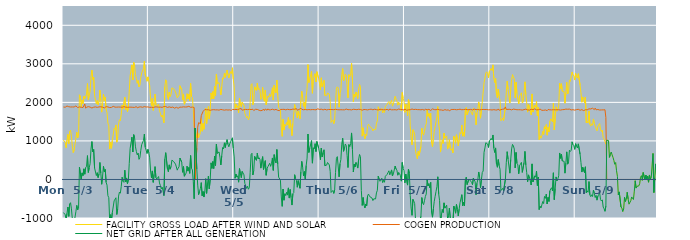
| Category | FACILITY GROSS LOAD AFTER WIND AND SOLAR | COGEN PRODUCTION | NET GRID AFTER ALL GENERATION |
|---|---|---|---|
|  Mon  5/3 | 1020 | 1879 | -859 |
|  Mon  5/3 | 1006 | 1865 | -859 |
|  Mon  5/3 | 959 | 1874 | -915 |
|  Mon  5/3 | 821 | 1864 | -1043 |
|  Mon  5/3 | 1027 | 1906 | -879 |
|  Mon  5/3 | 1168 | 1883 | -715 |
|  Mon  5/3 | 931 | 1887 | -956 |
|  Mon  5/3 | 1247 | 1882 | -635 |
|  Mon  5/3 | 1277 | 1880 | -603 |
|  Mon  5/3 | 1108 | 1871 | -763 |
|  Mon  5/3 | 859 | 1881 | -1022 |
|  Mon  5/3 | 697 | 1879 | -1182 |
|  Mon  5/3 | 758 | 1880 | -1122 |
|  Mon  5/3 | 781 | 1889 | -1108 |
|  Mon  5/3 | 1074 | 1907 | -833 |
|  Mon  5/3 | 1224 | 1897 | -673 |
|  Mon  5/3 | 1075 | 1865 | -790 |
|  Mon  5/3 | 1133 | 1890 | -757 |
|  Mon  5/3 | 2198 | 1882 | 316 |
|  Mon  5/3 | 2166 | 1873 | 293 |
|  Mon  5/3 | 1882 | 1872 | 10 |
|  Mon  5/3 | 2064 | 1894 | 170 |
|  Mon  5/3 | 1967 | 1866 | 101 |
|  Mon  5/3 | 2160 | 1884 | 276 |
|  Mon  5/3 | 2093 | 1957 | 136 |
|  Mon  5/3 | 2156 | 1848 | 308 |
|  Mon  5/3 | 2215 | 1874 | 341 |
|  Mon  5/3 | 2488 | 1870 | 618 |
|  Mon  5/3 | 2070 | 1889 | 181 |
|  Mon  5/3 | 2180 | 1874 | 306 |
|  Mon  5/3 | 2287 | 1877 | 410 |
|  Mon  5/3 | 2663 | 1876 | 787 |
|  Mon  5/3 | 2836 | 1853 | 983 |
|  Mon  5/3 | 2590 | 1875 | 715 |
|  Mon  5/3 | 2651 | 1875 | 776 |
|  Mon  5/3 | 2177 | 1880 | 297 |
|  Mon  5/3 | 2174 | 1882 | 292 |
|  Mon  5/3 | 1959 | 1859 | 100 |
|  Mon  5/3 | 2046 | 1870 | 176 |
|  Mon  5/3 | 1936 | 1887 | 49 |
|  Mon  5/3 | 2024 | 1882 | 142 |
|  Mon  5/3 | 2317 | 1876 | 441 |
|  Mon  5/3 | 2052 | 1885 | 167 |
|  Mon  5/3 | 1746 | 1871 | -125 |
|  Mon  5/3 | 1957 | 1876 | 81 |
|  Mon  5/3 | 2214 | 1874 | 340 |
|  Mon  5/3 | 2050 | 1855 | 195 |
|  Mon  5/3 | 2137 | 1878 | 259 |
|  Mon  5/3 | 1814 | 1890 | -76 |
|  Mon  5/3 | 1733 | 1881 | -148 |
|  Mon  5/3 | 1461 | 1882 | -421 |
|  Mon  5/3 | 1394 | 1867 | -473 |
|  Mon  5/3 | 789 | 1864 | -1075 |
|  Mon  5/3 | 965 | 1880 | -915 |
|  Mon  5/3 | 808 | 1869 | -1061 |
|  Mon  5/3 | 1012 | 1869 | -857 |
|  Mon  5/3 | 1035 | 1897 | -862 |
|  Mon  5/3 | 1329 | 1884 | -555 |
|  Mon  5/3 | 1302 | 1876 | -574 |
|  Mon  5/3 | 1414 | 1889 | -475 |
|  Mon  5/3 | 967 | 1876 | -909 |
|  Mon  5/3 | 1098 | 1864 | -766 |
|  Mon  5/3 | 1448 | 1879 | -431 |
|  Mon  5/3 | 1552 | 1879 | -327 |
|  Mon  5/3 | 1520 | 1877 | -357 |
|  Mon  5/3 | 1688 | 1871 | -183 |
|  Mon  5/3 | 1930 | 1873 | 57 |
|  Mon  5/3 | 1829 | 1876 | -47 |
|  Mon  5/3 | 1813 | 1888 | -75 |
|  Mon  5/3 | 2133 | 1892 | 241 |
|  Mon  5/3 | 1811 | 1876 | -65 |
|  Mon  5/3 | 1918 | 1879 | 39 |
|  Mon  5/3 | 1761 | 1871 | -110 |
|  Mon  5/3 | 1856 | 1865 | -9 |
|  Mon  5/3 | 2288 | 1875 | 413 |
|  Mon  5/3 | 2692 | 1887 | 805 |
|  Mon  5/3 | 2696 | 1876 | 820 |
|  Mon  5/3 | 2972 | 1875 | 1097 |
|  Mon  5/3 | 2584 | 1872 | 712 |
|  Mon  5/3 | 3037 | 1874 | 1163 |
|  Mon  5/3 | 2951 | 1869 | 1082 |
|  Mon  5/3 | 2718 | 1872 | 846 |
|  Mon  5/3 | 2616 | 1891 | 725 |
|  Mon  5/3 | 2495 | 1857 | 638 |
|  Mon  5/3 | 2566 | 1881 | 685 |
|  Mon  5/3 | 2401 | 1879 | 522 |
|  Mon  5/3 | 2448 | 1875 | 573 |
|  Mon  5/3 | 2641 | 1883 | 758 |
|  Mon  5/3 | 2765 | 1863 | 902 |
|  Mon  5/3 | 2765 | 1872 | 893 |
|  Mon  5/3 | 2880 | 1867 | 1013 |
|  Mon  5/3 | 3066 | 1890 | 1176 |
|  Mon  5/3 | 2710 | 1876 | 834 |
|  Mon  5/3 | 2641 | 1879 | 762 |
|  Mon  5/3 | 2547 | 1873 | 674 |
|  Mon  5/3 | 2661 | 1882 | 779 |
|  Tue  5/4 | 2564 | 1869 | 695 |
|  Tue  5/4 | 2431 | 1871 | 560 |
|  Tue  5/4 | 2094 | 1875 | 219 |
|  Tue  5/4 | 1917 | 1873 | 44 |
|  Tue  5/4 | 2102 | 1881 | 221 |
|  Tue  5/4 | 1792 | 1867 | -75 |
|  Tue  5/4 | 2001 | 1867 | 134 |
|  Tue  5/4 | 2215 | 1882 | 333 |
|  Tue  5/4 | 1931 | 1887 | 44 |
|  Tue  5/4 | 1895 | 1882 | 13 |
|  Tue  5/4 | 1900 | 1890 | 10 |
|  Tue  5/4 | 1951 | 1875 | 76 |
|  Tue  5/4 | 1783 | 1874 | -91 |
|  Tue  5/4 | 1721 | 1877 | -156 |
|  Tue  5/4 | 1626 | 1871 | -245 |
|  Tue  5/4 | 1672 | 1871 | -199 |
|  Tue  5/4 | 1575 | 1869 | -294 |
|  Tue  5/4 | 1469 | 1890 | -421 |
|  Tue  5/4 | 2404 | 1876 | 528 |
|  Tue  5/4 | 2587 | 1892 | 695 |
|  Tue  5/4 | 2555 | 1872 | 683 |
|  Tue  5/4 | 2136 | 1868 | 268 |
|  Tue  5/4 | 2077 | 1879 | 198 |
|  Tue  5/4 | 2263 | 1884 | 379 |
|  Tue  5/4 | 2150 | 1883 | 267 |
|  Tue  5/4 | 2204 | 1867 | 337 |
|  Tue  5/4 | 2377 | 1875 | 502 |
|  Tue  5/4 | 2375 | 1879 | 496 |
|  Tue  5/4 | 2350 | 1887 | 463 |
|  Tue  5/4 | 2308 | 1849 | 459 |
|  Tue  5/4 | 2270 | 1872 | 398 |
|  Tue  5/4 | 2196 | 1872 | 324 |
|  Tue  5/4 | 2120 | 1879 | 241 |
|  Tue  5/4 | 2139 | 1847 | 292 |
|  Tue  5/4 | 2188 | 1860 | 328 |
|  Tue  5/4 | 2433 | 1877 | 556 |
|  Tue  5/4 | 2427 | 1876 | 551 |
|  Tue  5/4 | 2322 | 1875 | 447 |
|  Tue  5/4 | 2069 | 1883 | 186 |
|  Tue  5/4 | 2219 | 1884 | 335 |
|  Tue  5/4 | 1950 | 1868 | 82 |
|  Tue  5/4 | 1957 | 1879 | 78 |
|  Tue  5/4 | 2042 | 1875 | 167 |
|  Tue  5/4 | 2225 | 1881 | 344 |
|  Tue  5/4 | 2088 | 1871 | 217 |
|  Tue  5/4 | 2208 | 1898 | 310 |
|  Tue  5/4 | 2040 | 1881 | 159 |
|  Tue  5/4 | 2491 | 1871 | 620 |
|  Tue  5/4 | 2153 | 1862 | 291 |
|  Tue  5/4 | 2125 | 1878 | 247 |
|  Tue  5/4 | 1823 | 1870 | -47 |
|  Tue  5/4 | 1366 | 1866 | -500 |
|  Tue  5/4 | 1334 | 0 | 1334 |
|  Tue  5/4 | 1318 | 0 | 1318 |
|  Tue  5/4 | 1082 | 813 | 269 |
|  Tue  5/4 | 1209 | 1356 | -147 |
|  Tue  5/4 | 1079 | 1473 | -394 |
|  Tue  5/4 | 1141 | 1451 | -310 |
|  Tue  5/4 | 1215 | 1449 | -234 |
|  Tue  5/4 | 1574 | 1657 | -83 |
|  Tue  5/4 | 1251 | 1673 | -422 |
|  Tue  5/4 | 1451 | 1763 | -312 |
|  Tue  5/4 | 1301 | 1757 | -456 |
|  Tue  5/4 | 1507 | 1815 | -308 |
|  Tue  5/4 | 1851 | 1830 | 21 |
|  Tue  5/4 | 1448 | 1809 | -361 |
|  Tue  5/4 | 1683 | 1803 | -120 |
|  Tue  5/4 | 1893 | 1808 | 85 |
|  Tue  5/4 | 1568 | 1812 | -244 |
|  Tue  5/4 | 1780 | 1793 | -13 |
|  Tue  5/4 | 2245 | 1814 | 431 |
|  Tue  5/4 | 2092 | 1806 | 286 |
|  Tue  5/4 | 2278 | 1813 | 465 |
|  Tue  5/4 | 2093 | 1810 | 283 |
|  Tue  5/4 | 2415 | 1809 | 606 |
|  Tue  5/4 | 2164 | 1805 | 359 |
|  Tue  5/4 | 2732 | 1818 | 914 |
|  Tue  5/4 | 2481 | 1806 | 675 |
|  Tue  5/4 | 2497 | 1805 | 692 |
|  Tue  5/4 | 2513 | 1798 | 715 |
|  Tue  5/4 | 2373 | 1794 | 579 |
|  Tue  5/4 | 2193 | 1817 | 376 |
|  Tue  5/4 | 2402 | 1794 | 608 |
|  Tue  5/4 | 2636 | 1807 | 829 |
|  Tue  5/4 | 2609 | 1818 | 791 |
|  Tue  5/4 | 2749 | 1798 | 951 |
|  Tue  5/4 | 2650 | 1822 | 828 |
|  Tue  5/4 | 2759 | 1807 | 952 |
|  Tue  5/4 | 2840 | 1806 | 1034 |
|  Tue  5/4 | 2712 | 1801 | 911 |
|  Tue  5/4 | 2632 | 1785 | 847 |
|  Tue  5/4 | 2728 | 1805 | 923 |
|  Tue  5/4 | 2799 | 1819 | 980 |
|  Tue  5/4 | 2749 | 1790 | 959 |
|  Tue  5/4 | 2898 | 1818 | 1080 |
|  Tue  5/4 | 2604 | 1799 | 805 |
|  Wed  5/5 | 2396 | 1812 | 584 |
|  Wed  5/5 | 1841 | 1811 | 30 |
|  Wed  5/5 | 1956 | 1816 | 140 |
|  Wed  5/5 | 1871 | 1809 | 62 |
|  Wed  5/5 | 1905 | 1810 | 95 |
|  Wed  5/5 | 1730 | 1801 | -71 |
|  Wed  5/5 | 2114 | 1833 | 281 |
|  Wed  5/5 | 1958 | 1809 | 149 |
|  Wed  5/5 | 1883 | 1837 | 46 |
|  Wed  5/5 | 2007 | 1797 | 210 |
|  Wed  5/5 | 2001 | 1815 | 186 |
|  Wed  5/5 | 1929 | 1809 | 120 |
|  Wed  5/5 | 1710 | 1815 | -105 |
|  Wed  5/5 | 1650 | 1818 | -168 |
|  Wed  5/5 | 1602 | 1834 | -232 |
|  Wed  5/5 | 1636 | 1812 | -176 |
|  Wed  5/5 | 1546 | 1800 | -254 |
|  Wed  5/5 | 1607 | 1819 | -212 |
|  Wed  5/5 | 1992 | 1807 | 185 |
|  Wed  5/5 | 2458 | 1813 | 645 |
|  Wed  5/5 | 2485 | 1806 | 679 |
|  Wed  5/5 | 1937 | 1821 | 116 |
|  Wed  5/5 | 2019 | 1789 | 230 |
|  Wed  5/5 | 2404 | 1804 | 600 |
|  Wed  5/5 | 2414 | 1820 | 594 |
|  Wed  5/5 | 2308 | 1812 | 496 |
|  Wed  5/5 | 2501 | 1817 | 684 |
|  Wed  5/5 | 2330 | 1797 | 533 |
|  Wed  5/5 | 2358 | 1796 | 562 |
|  Wed  5/5 | 2326 | 1806 | 520 |
|  Wed  5/5 | 2077 | 1783 | 294 |
|  Wed  5/5 | 2117 | 1805 | 312 |
|  Wed  5/5 | 2388 | 1797 | 591 |
|  Wed  5/5 | 2085 | 1826 | 259 |
|  Wed  5/5 | 2030 | 1788 | 242 |
|  Wed  5/5 | 2315 | 1828 | 487 |
|  Wed  5/5 | 1933 | 1825 | 108 |
|  Wed  5/5 | 2081 | 1796 | 285 |
|  Wed  5/5 | 2166 | 1832 | 334 |
|  Wed  5/5 | 2133 | 1806 | 327 |
|  Wed  5/5 | 2223 | 1802 | 421 |
|  Wed  5/5 | 2147 | 1807 | 340 |
|  Wed  5/5 | 2240 | 1824 | 416 |
|  Wed  5/5 | 2380 | 1822 | 558 |
|  Wed  5/5 | 2060 | 1825 | 235 |
|  Wed  5/5 | 2448 | 1804 | 644 |
|  Wed  5/5 | 2297 | 1811 | 486 |
|  Wed  5/5 | 2245 | 1817 | 428 |
|  Wed  5/5 | 2574 | 1798 | 776 |
|  Wed  5/5 | 2188 | 1793 | 395 |
|  Wed  5/5 | 1866 | 1806 | 60 |
|  Wed  5/5 | 1852 | 1786 | 66 |
|  Wed  5/5 | 1799 | 1816 | -17 |
|  Wed  5/5 | 1353 | 1808 | -455 |
|  Wed  5/5 | 1119 | 1817 | -698 |
|  Wed  5/5 | 1560 | 1810 | -250 |
|  Wed  5/5 | 1281 | 1820 | -539 |
|  Wed  5/5 | 1428 | 1798 | -370 |
|  Wed  5/5 | 1388 | 1806 | -418 |
|  Wed  5/5 | 1479 | 1811 | -332 |
|  Wed  5/5 | 1414 | 1820 | -406 |
|  Wed  5/5 | 1606 | 1825 | -219 |
|  Wed  5/5 | 1329 | 1812 | -483 |
|  Wed  5/5 | 1544 | 1805 | -261 |
|  Wed  5/5 | 1340 | 1811 | -471 |
|  Wed  5/5 | 1136 | 1800 | -664 |
|  Wed  5/5 | 1454 | 1825 | -371 |
|  Wed  5/5 | 1470 | 1811 | -341 |
|  Wed  5/5 | 1944 | 1821 | 123 |
|  Wed  5/5 | 1832 | 1807 | 25 |
|  Wed  5/5 | 1816 | 1839 | -23 |
|  Wed  5/5 | 1594 | 1796 | -202 |
|  Wed  5/5 | 1772 | 1802 | -30 |
|  Wed  5/5 | 1781 | 1816 | -35 |
|  Wed  5/5 | 1576 | 1804 | -228 |
|  Wed  5/5 | 2048 | 1848 | 200 |
|  Wed  5/5 | 2289 | 1820 | 469 |
|  Wed  5/5 | 2133 | 1818 | 315 |
|  Wed  5/5 | 1900 | 1808 | 92 |
|  Wed  5/5 | 2003 | 1798 | 205 |
|  Wed  5/5 | 1822 | 1815 | 7 |
|  Wed  5/5 | 2170 | 1807 | 363 |
|  Wed  5/5 | 2361 | 1807 | 554 |
|  Wed  5/5 | 2981 | 1802 | 1179 |
|  Wed  5/5 | 2514 | 1814 | 700 |
|  Wed  5/5 | 2611 | 1800 | 811 |
|  Wed  5/5 | 2613 | 1808 | 805 |
|  Wed  5/5 | 2807 | 1799 | 1008 |
|  Wed  5/5 | 2237 | 1814 | 423 |
|  Wed  5/5 | 2622 | 1800 | 822 |
|  Wed  5/5 | 2601 | 1811 | 790 |
|  Wed  5/5 | 2745 | 1817 | 928 |
|  Wed  5/5 | 2530 | 1806 | 724 |
|  Wed  5/5 | 2797 | 1813 | 984 |
|  Wed  5/5 | 2819 | 1833 | 986 |
|  Wed  5/5 | 2619 | 1811 | 808 |
|  Thu  5/6 | 2502 | 1816 | 686 |
|  Thu  5/6 | 2322 | 1812 | 510 |
|  Thu  5/6 | 2637 | 1823 | 814 |
|  Thu  5/6 | 2409 | 1825 | 584 |
|  Thu  5/6 | 2494 | 1804 | 690 |
|  Thu  5/6 | 2572 | 1802 | 770 |
|  Thu  5/6 | 2177 | 1821 | 356 |
|  Thu  5/6 | 2190 | 1810 | 380 |
|  Thu  5/6 | 2175 | 1803 | 372 |
|  Thu  5/6 | 2242 | 1802 | 440 |
|  Thu  5/6 | 2232 | 1816 | 416 |
|  Thu  5/6 | 2212 | 1836 | 376 |
|  Thu  5/6 | 2020 | 1815 | 205 |
|  Thu  5/6 | 1478 | 1816 | -338 |
|  Thu  5/6 | 1454 | 1813 | -359 |
|  Thu  5/6 | 1546 | 1831 | -285 |
|  Thu  5/6 | 1448 | 1810 | -362 |
|  Thu  5/6 | 1541 | 1804 | -263 |
|  Thu  5/6 | 2002 | 1820 | 182 |
|  Thu  5/6 | 2370 | 1821 | 549 |
|  Thu  5/6 | 2403 | 1811 | 592 |
|  Thu  5/6 | 2374 | 1805 | 569 |
|  Thu  5/6 | 1875 | 1807 | 68 |
|  Thu  5/6 | 2223 | 1812 | 411 |
|  Thu  5/6 | 2326 | 1809 | 517 |
|  Thu  5/6 | 2720 | 1804 | 916 |
|  Thu  5/6 | 2876 | 1807 | 1069 |
|  Thu  5/6 | 2556 | 1825 | 731 |
|  Thu  5/6 | 2618 | 1806 | 812 |
|  Thu  5/6 | 2731 | 1813 | 918 |
|  Thu  5/6 | 2705 | 1827 | 878 |
|  Thu  5/6 | 2433 | 1809 | 624 |
|  Thu  5/6 | 2119 | 1809 | 310 |
|  Thu  5/6 | 2718 | 1814 | 904 |
|  Thu  5/6 | 2665 | 1811 | 854 |
|  Thu  5/6 | 2742 | 1815 | 927 |
|  Thu  5/6 | 3011 | 1804 | 1207 |
|  Thu  5/6 | 2583 | 1802 | 781 |
|  Thu  5/6 | 2014 | 1821 | 193 |
|  Thu  5/6 | 2214 | 1813 | 401 |
|  Thu  5/6 | 2143 | 1816 | 327 |
|  Thu  5/6 | 2264 | 1822 | 442 |
|  Thu  5/6 | 2189 | 1810 | 379 |
|  Thu  5/6 | 2100 | 1805 | 295 |
|  Thu  5/6 | 2345 | 1821 | 524 |
|  Thu  5/6 | 2467 | 1819 | 648 |
|  Thu  5/6 | 2406 | 1816 | 590 |
|  Thu  5/6 | 1538 | 1828 | -290 |
|  Thu  5/6 | 1123 | 1797 | -674 |
|  Thu  5/6 | 1341 | 1809 | -468 |
|  Thu  5/6 | 1153 | 1815 | -662 |
|  Thu  5/6 | 1057 | 1796 | -739 |
|  Thu  5/6 | 1176 | 1812 | -636 |
|  Thu  5/6 | 1136 | 1824 | -688 |
|  Thu  5/6 | 1374 | 1804 | -430 |
|  Thu  5/6 | 1435 | 1815 | -380 |
|  Thu  5/6 | 1398 | 1816 | -418 |
|  Thu  5/6 | 1361 | 1819 | -458 |
|  Thu  5/6 | 1371 | 1824 | -453 |
|  Thu  5/6 | 1328 | 1809 | -481 |
|  Thu  5/6 | 1259 | 1807 | -548 |
|  Thu  5/6 | 1300 | 1801 | -501 |
|  Thu  5/6 | 1319 | 1822 | -503 |
|  Thu  5/6 | 1290 | 1797 | -507 |
|  Thu  5/6 | 1462 | 1811 | -349 |
|  Thu  5/6 | 1519 | 1801 | -282 |
|  Thu  5/6 | 1886 | 1802 | 84 |
|  Thu  5/6 | 1803 | 1792 | 11 |
|  Thu  5/6 | 1775 | 1823 | -48 |
|  Thu  5/6 | 1782 | 1801 | -19 |
|  Thu  5/6 | 1842 | 1811 | 31 |
|  Thu  5/6 | 1725 | 1808 | -83 |
|  Thu  5/6 | 1790 | 1809 | -19 |
|  Thu  5/6 | 1737 | 1810 | -73 |
|  Thu  5/6 | 1890 | 1808 | 82 |
|  Thu  5/6 | 1895 | 1805 | 90 |
|  Thu  5/6 | 1949 | 1818 | 131 |
|  Thu  5/6 | 1990 | 1811 | 179 |
|  Thu  5/6 | 2022 | 1797 | 225 |
|  Thu  5/6 | 1946 | 1828 | 118 |
|  Thu  5/6 | 1965 | 1827 | 138 |
|  Thu  5/6 | 2054 | 1806 | 248 |
|  Thu  5/6 | 1902 | 1812 | 90 |
|  Thu  5/6 | 1952 | 1808 | 144 |
|  Thu  5/6 | 1948 | 1813 | 135 |
|  Thu  5/6 | 2159 | 1810 | 349 |
|  Thu  5/6 | 2089 | 1815 | 274 |
|  Thu  5/6 | 2039 | 1802 | 237 |
|  Thu  5/6 | 1927 | 1817 | 110 |
|  Thu  5/6 | 2006 | 1827 | 179 |
|  Thu  5/6 | 1981 | 1832 | 149 |
|  Thu  5/6 | 1913 | 1815 | 98 |
|  Thu  5/6 | 1777 | 1821 | -44 |
|  Thu  5/6 | 2256 | 1816 | 440 |
|  Thu  5/6 | 2100 | 1809 | 291 |
|  Thu  5/6 | 2025 | 1799 | 226 |
|  Fri  5/7 | 1741 | 1828 | -87 |
|  Fri  5/7 | 1955 | 1816 | 139 |
|  Fri  5/7 | 1919 | 1795 | 124 |
|  Fri  5/7 | 1652 | 1798 | -146 |
|  Fri  5/7 | 2076 | 1807 | 269 |
|  Fri  5/7 | 1961 | 1806 | 155 |
|  Fri  5/7 | 1394 | 1809 | -415 |
|  Fri  5/7 | 1055 | 1798 | -743 |
|  Fri  5/7 | 898 | 1828 | -930 |
|  Fri  5/7 | 1292 | 1810 | -518 |
|  Fri  5/7 | 1248 | 1813 | -565 |
|  Fri  5/7 | 1177 | 1805 | -628 |
|  Fri  5/7 | 730 | 1820 | -1090 |
|  Fri  5/7 | 624 | 1817 | -1193 |
|  Fri  5/7 | 535 | 1812 | -1277 |
|  Fri  5/7 | 730 | 1829 | -1099 |
|  Fri  5/7 | 624 | 1811 | -1187 |
|  Fri  5/7 | 604 | 1804 | -1200 |
|  Fri  5/7 | 851 | 1807 | -956 |
|  Fri  5/7 | 1329 | 1799 | -470 |
|  Fri  5/7 | 1203 | 1815 | -612 |
|  Fri  5/7 | 1150 | 1804 | -654 |
|  Fri  5/7 | 1243 | 1796 | -553 |
|  Fri  5/7 | 1383 | 1826 | -443 |
|  Fri  5/7 | 1440 | 1818 | -378 |
|  Fri  5/7 | 1810 | 1806 | 4 |
|  Fri  5/7 | 1638 | 1807 | -169 |
|  Fri  5/7 | 1712 | 1820 | -108 |
|  Fri  5/7 | 1590 | 1809 | -219 |
|  Fri  5/7 | 1713 | 1790 | -77 |
|  Fri  5/7 | 948 | 1810 | -862 |
|  Fri  5/7 | 851 | 1830 | -979 |
|  Fri  5/7 | 1061 | 1825 | -764 |
|  Fri  5/7 | 1246 | 1813 | -567 |
|  Fri  5/7 | 1369 | 1807 | -438 |
|  Fri  5/7 | 1497 | 1808 | -311 |
|  Fri  5/7 | 1619 | 1806 | -187 |
|  Fri  5/7 | 1891 | 1822 | 69 |
|  Fri  5/7 | 1437 | 1811 | -374 |
|  Fri  5/7 | 1253 | 1805 | -552 |
|  Fri  5/7 | 710 | 1812 | -1102 |
|  Fri  5/7 | 876 | 1803 | -927 |
|  Fri  5/7 | 1030 | 1809 | -779 |
|  Fri  5/7 | 934 | 1792 | -858 |
|  Fri  5/7 | 1204 | 1811 | -607 |
|  Fri  5/7 | 1067 | 1812 | -745 |
|  Fri  5/7 | 1048 | 1810 | -762 |
|  Fri  5/7 | 1130 | 1798 | -668 |
|  Fri  5/7 | 788 | 1807 | -1019 |
|  Fri  5/7 | 868 | 1807 | -939 |
|  Fri  5/7 | 1033 | 1778 | -745 |
|  Fri  5/7 | 806 | 1802 | -996 |
|  Fri  5/7 | 758 | 1813 | -1055 |
|  Fri  5/7 | 799 | 1797 | -998 |
|  Fri  5/7 | 687 | 1816 | -1129 |
|  Fri  5/7 | 1118 | 1809 | -691 |
|  Fri  5/7 | 1047 | 1816 | -769 |
|  Fri  5/7 | 940 | 1816 | -876 |
|  Fri  5/7 | 1159 | 1808 | -649 |
|  Fri  5/7 | 1033 | 1815 | -782 |
|  Fri  5/7 | 869 | 1814 | -945 |
|  Fri  5/7 | 1033 | 1803 | -770 |
|  Fri  5/7 | 1218 | 1823 | -605 |
|  Fri  5/7 | 1186 | 1814 | -628 |
|  Fri  5/7 | 1413 | 1808 | -395 |
|  Fri  5/7 | 1123 | 1806 | -683 |
|  Fri  5/7 | 1227 | 1813 | -586 |
|  Fri  5/7 | 1119 | 1804 | -685 |
|  Fri  5/7 | 1803 | 1820 | -17 |
|  Fri  5/7 | 1865 | 1806 | 59 |
|  Fri  5/7 | 1678 | 1810 | -132 |
|  Fri  5/7 | 1664 | 1807 | -143 |
|  Fri  5/7 | 1821 | 1810 | 11 |
|  Fri  5/7 | 1838 | 1825 | 13 |
|  Fri  5/7 | 1771 | 1817 | -46 |
|  Fri  5/7 | 1748 | 1821 | -73 |
|  Fri  5/7 | 1669 | 1804 | -135 |
|  Fri  5/7 | 1850 | 1814 | 36 |
|  Fri  5/7 | 1862 | 1823 | 39 |
|  Fri  5/7 | 1750 | 1812 | -62 |
|  Fri  5/7 | 1415 | 1812 | -397 |
|  Fri  5/7 | 1722 | 1820 | -98 |
|  Fri  5/7 | 1806 | 1815 | -9 |
|  Fri  5/7 | 2012 | 1818 | 194 |
|  Fri  5/7 | 1852 | 1806 | 46 |
|  Fri  5/7 | 1588 | 1805 | -217 |
|  Fri  5/7 | 1799 | 1812 | -13 |
|  Fri  5/7 | 2012 | 1831 | 181 |
|  Fri  5/7 | 2035 | 1816 | 219 |
|  Fri  5/7 | 2508 | 1804 | 704 |
|  Fri  5/7 | 2631 | 1813 | 818 |
|  Fri  5/7 | 2760 | 1808 | 952 |
|  Fri  5/7 | 2791 | 1815 | 976 |
|  Fri  5/7 | 2745 | 1825 | 920 |
|  Fri  5/7 | 2636 | 1806 | 830 |
|  Fri  5/7 | 2805 | 1808 | 997 |
|  Sat  5/8 | 2785 | 1808 | 977 |
|  Sat  5/8 | 2879 | 1816 | 1063 |
|  Sat  5/8 | 2827 | 1802 | 1025 |
|  Sat  5/8 | 2973 | 1819 | 1154 |
|  Sat  5/8 | 2623 | 1811 | 812 |
|  Sat  5/8 | 2516 | 1816 | 700 |
|  Sat  5/8 | 2620 | 1802 | 818 |
|  Sat  5/8 | 2202 | 1808 | 394 |
|  Sat  5/8 | 2117 | 1801 | 316 |
|  Sat  5/8 | 2346 | 1830 | 516 |
|  Sat  5/8 | 2152 | 1795 | 357 |
|  Sat  5/8 | 2052 | 1791 | 261 |
|  Sat  5/8 | 1522 | 1810 | -288 |
|  Sat  5/8 | 1537 | 1806 | -269 |
|  Sat  5/8 | 1591 | 1822 | -231 |
|  Sat  5/8 | 1528 | 1822 | -294 |
|  Sat  5/8 | 1550 | 1829 | -279 |
|  Sat  5/8 | 1884 | 1882 | 2 |
|  Sat  5/8 | 2248 | 1815 | 433 |
|  Sat  5/8 | 2550 | 1830 | 720 |
|  Sat  5/8 | 2345 | 1819 | 526 |
|  Sat  5/8 | 2331 | 1805 | 526 |
|  Sat  5/8 | 1982 | 1819 | 163 |
|  Sat  5/8 | 2331 | 1812 | 519 |
|  Sat  5/8 | 2597 | 1805 | 792 |
|  Sat  5/8 | 2721 | 1812 | 909 |
|  Sat  5/8 | 2696 | 1825 | 871 |
|  Sat  5/8 | 2602 | 1813 | 789 |
|  Sat  5/8 | 2117 | 1818 | 299 |
|  Sat  5/8 | 2524 | 1823 | 701 |
|  Sat  5/8 | 2225 | 1808 | 417 |
|  Sat  5/8 | 2203 | 1824 | 379 |
|  Sat  5/8 | 1957 | 1809 | 148 |
|  Sat  5/8 | 2166 | 1802 | 364 |
|  Sat  5/8 | 2207 | 1808 | 399 |
|  Sat  5/8 | 2249 | 1805 | 444 |
|  Sat  5/8 | 1983 | 1800 | 183 |
|  Sat  5/8 | 2009 | 1811 | 198 |
|  Sat  5/8 | 2252 | 1812 | 440 |
|  Sat  5/8 | 2532 | 1804 | 728 |
|  Sat  5/8 | 2202 | 1825 | 377 |
|  Sat  5/8 | 1980 | 1806 | 174 |
|  Sat  5/8 | 1746 | 1805 | -59 |
|  Sat  5/8 | 1945 | 1825 | 120 |
|  Sat  5/8 | 1867 | 1799 | 68 |
|  Sat  5/8 | 1879 | 1789 | 90 |
|  Sat  5/8 | 1676 | 1820 | -144 |
|  Sat  5/8 | 2219 | 1815 | 404 |
|  Sat  5/8 | 1748 | 1812 | -64 |
|  Sat  5/8 | 1751 | 1810 | -59 |
|  Sat  5/8 | 1924 | 1831 | 93 |
|  Sat  5/8 | 1877 | 1818 | 59 |
|  Sat  5/8 | 2024 | 1806 | 218 |
|  Sat  5/8 | 1647 | 1805 | -158 |
|  Sat  5/8 | 1867 | 1808 | 59 |
|  Sat  5/8 | 1035 | 1815 | -780 |
|  Sat  5/8 | 1133 | 1826 | -693 |
|  Sat  5/8 | 1068 | 1810 | -742 |
|  Sat  5/8 | 1135 | 1794 | -659 |
|  Sat  5/8 | 1243 | 1816 | -573 |
|  Sat  5/8 | 1168 | 1794 | -626 |
|  Sat  5/8 | 1369 | 1808 | -439 |
|  Sat  5/8 | 1313 | 1803 | -490 |
|  Sat  5/8 | 1426 | 1806 | -380 |
|  Sat  5/8 | 1149 | 1785 | -636 |
|  Sat  5/8 | 1351 | 1816 | -465 |
|  Sat  5/8 | 1235 | 1806 | -571 |
|  Sat  5/8 | 1508 | 1806 | -298 |
|  Sat  5/8 | 1573 | 1819 | -246 |
|  Sat  5/8 | 1590 | 1805 | -215 |
|  Sat  5/8 | 1494 | 1792 | -298 |
|  Sat  5/8 | 1983 | 1810 | 173 |
|  Sat  5/8 | 1283 | 1808 | -525 |
|  Sat  5/8 | 1574 | 1806 | -232 |
|  Sat  5/8 | 1884 | 1818 | 66 |
|  Sat  5/8 | 1770 | 1809 | -39 |
|  Sat  5/8 | 1819 | 1802 | 17 |
|  Sat  5/8 | 1903 | 1808 | 95 |
|  Sat  5/8 | 2500 | 1813 | 687 |
|  Sat  5/8 | 2348 | 1800 | 548 |
|  Sat  5/8 | 2483 | 1824 | 659 |
|  Sat  5/8 | 2288 | 1810 | 478 |
|  Sat  5/8 | 2292 | 1793 | 499 |
|  Sat  5/8 | 2286 | 1813 | 473 |
|  Sat  5/8 | 1977 | 1814 | 163 |
|  Sat  5/8 | 2250 | 1825 | 425 |
|  Sat  5/8 | 2520 | 1804 | 716 |
|  Sat  5/8 | 2218 | 1821 | 397 |
|  Sat  5/8 | 2278 | 1822 | 456 |
|  Sat  5/8 | 2583 | 1825 | 758 |
|  Sat  5/8 | 2543 | 1816 | 727 |
|  Sat  5/8 | 2560 | 1803 | 757 |
|  Sat  5/8 | 2789 | 1813 | 976 |
|  Sat  5/8 | 2714 | 1810 | 904 |
|  Sat  5/8 | 2681 | 1805 | 876 |
|  Sat  5/8 | 2579 | 1798 | 781 |
|  Sun  5/9 | 2749 | 1822 | 927 |
|  Sun  5/9 | 2673 | 1812 | 861 |
|  Sun  5/9 | 2631 | 1813 | 818 |
|  Sun  5/9 | 2744 | 1820 | 924 |
|  Sun  5/9 | 2741 | 1796 | 945 |
|  Sun  5/9 | 2447 | 1795 | 652 |
|  Sun  5/9 | 2247 | 1810 | 437 |
|  Sun  5/9 | 2004 | 1812 | 192 |
|  Sun  5/9 | 2141 | 1824 | 317 |
|  Sun  5/9 | 2102 | 1786 | 316 |
|  Sun  5/9 | 1982 | 1804 | 178 |
|  Sun  5/9 | 2136 | 1808 | 328 |
|  Sun  5/9 | 1465 | 1810 | -345 |
|  Sun  5/9 | 1510 | 1807 | -297 |
|  Sun  5/9 | 1464 | 1796 | -332 |
|  Sun  5/9 | 1777 | 1832 | -55 |
|  Sun  5/9 | 1431 | 1831 | -400 |
|  Sun  5/9 | 1383 | 1829 | -446 |
|  Sun  5/9 | 1445 | 1843 | -398 |
|  Sun  5/9 | 1406 | 1848 | -442 |
|  Sun  5/9 | 1570 | 1844 | -274 |
|  Sun  5/9 | 1453 | 1812 | -359 |
|  Sun  5/9 | 1382 | 1851 | -469 |
|  Sun  5/9 | 1395 | 1807 | -412 |
|  Sun  5/9 | 1260 | 1797 | -537 |
|  Sun  5/9 | 1382 | 1815 | -433 |
|  Sun  5/9 | 1415 | 1805 | -390 |
|  Sun  5/9 | 1452 | 1801 | -349 |
|  Sun  5/9 | 1286 | 1805 | -519 |
|  Sun  5/9 | 1244 | 1804 | -560 |
|  Sun  5/9 | 1283 | 1812 | -529 |
|  Sun  5/9 | 1089 | 1805 | -716 |
|  Sun  5/9 | 1051 | 1811 | -760 |
|  Sun  5/9 | 982 | 1808 | -826 |
|  Sun  5/9 | 916 | 1606 | -690 |
|  Sun  5/9 | 1020 | 0 | 1020 |
|  Sun  5/9 | 1002 | 0 | 1002 |
|  Sun  5/9 | 1006 | 0 | 1006 |
|  Sun  5/9 | 573 | 0 | 573 |
|  Sun  5/9 | 650 | 0 | 650 |
|  Sun  5/9 | 712 | 0 | 712 |
|  Sun  5/9 | 637 | 0 | 637 |
|  Sun  5/9 | 575 | 0 | 575 |
|  Sun  5/9 | 493 | 0 | 493 |
|  Sun  5/9 | 394 | 0 | 394 |
|  Sun  5/9 | 439 | 0 | 439 |
|  Sun  5/9 | 225 | 0 | 225 |
|  Sun  5/9 | 80 | 0 | 80 |
|  Sun  5/9 | -404 | 0 | -404 |
|  Sun  5/9 | -323 | 0 | -323 |
|  Sun  5/9 | -309 | 0 | -309 |
|  Sun  5/9 | -715 | 0 | -715 |
|  Sun  5/9 | -741 | 0 | -741 |
|  Sun  5/9 | -834 | 0 | -834 |
|  Sun  5/9 | -766 | 0 | -766 |
|  Sun  5/9 | -464 | 0 | -464 |
|  Sun  5/9 | -572 | 0 | -572 |
|  Sun  5/9 | -511 | 0 | -511 |
|  Sun  5/9 | -332 | 0 | -332 |
|  Sun  5/9 | -505 | 0 | -505 |
|  Sun  5/9 | -641 | 0 | -641 |
|  Sun  5/9 | -644 | 0 | -644 |
|  Sun  5/9 | -553 | 0 | -553 |
|  Sun  5/9 | -454 | 0 | -454 |
|  Sun  5/9 | -436 | 0 | -436 |
|  Sun  5/9 | -520 | 0 | -520 |
|  Sun  5/9 | -303 | 0 | -303 |
|  Sun  5/9 | -34 | 0 | -34 |
|  Sun  5/9 | -224 | 0 | -224 |
|  Sun  5/9 | -178 | 0 | -178 |
|  Sun  5/9 | -189 | 0 | -189 |
|  Sun  5/9 | -167 | 0 | -167 |
|  Sun  5/9 | -111 | 0 | -111 |
|  Sun  5/9 | 57 | 0 | 57 |
|  Sun  5/9 | 98 | 0 | 98 |
|  Sun  5/9 | -22 | 0 | -22 |
|  Sun  5/9 | 180 | 0 | 180 |
|  Sun  5/9 | 163 | 0 | 163 |
|  Sun  5/9 | -14 | 0 | -14 |
|  Sun  5/9 | 115 | 0 | 115 |
|  Sun  5/9 | 9 | 0 | 9 |
|  Sun  5/9 | 84 | 0 | 84 |
|  Sun  5/9 | -71 | 0 | -71 |
|  Sun  5/9 | 116 | 0 | 116 |
|  Sun  5/9 | 12 | 0 | 12 |
|  Sun  5/9 | 42 | 0 | 42 |
|  Sun  5/9 | 20 | 0 | 20 |
|  Sun  5/9 | 674 | 0 | 674 |
|  Sun  5/9 | -340 | 0 | -340 |
|  Sun  5/9 | 50 | 0 | 50 |
|  Sun  5/9 | 403 | 0 | 403 |
|  Sun  5/9 | 97 | 0 | 97 |